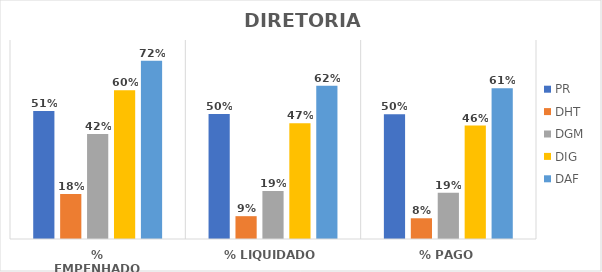
| Category | PR | DHT | DGM | DIG | DAF |
|---|---|---|---|---|---|
| % EMPENHADO | 0.515 | 0.181 | 0.422 | 0.598 | 0.716 |
| % LIQUIDADO | 0.503 | 0.092 | 0.193 | 0.465 | 0.616 |
| % PAGO | 0.502 | 0.083 | 0.186 | 0.456 | 0.606 |